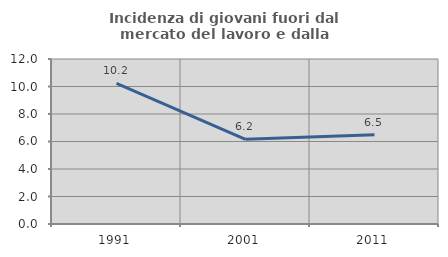
| Category | Incidenza di giovani fuori dal mercato del lavoro e dalla formazione  |
|---|---|
| 1991.0 | 10.22 |
| 2001.0 | 6.156 |
| 2011.0 | 6.483 |